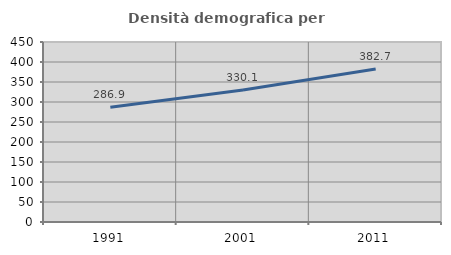
| Category | Densità demografica |
|---|---|
| 1991.0 | 286.885 |
| 2001.0 | 330.129 |
| 2011.0 | 382.71 |